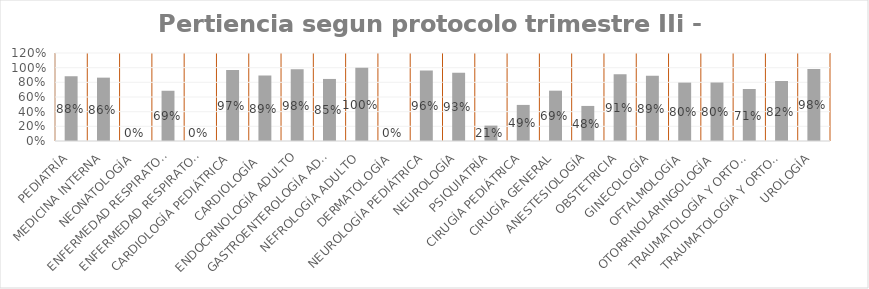
| Category | Series 0 |
|---|---|
| PEDIATRÍA | 0.884 |
| MEDICINA INTERNA | 0.864 |
| NEONATOLOGÍA | 0 |
| ENFERMEDAD RESPIRATORIA PEDIÁTRICA (BRONCOPULMONAR INFANTIL) | 0.685 |
| ENFERMEDAD RESPIRATORIA DE ADULTO (BRONCOPULMONAR) | 0 |
| CARDIOLOGÍA PEDIÁTRICA | 0.969 |
| CARDIOLOGÍA  | 0.894 |
| ENDOCRINOLOGÍA ADULTO | 0.98 |
| GASTROENTEROLOGÍA ADULTO | 0.846 |
| NEFROLOGÍA ADULTO | 1 |
| DERMATOLOGÍA | 0 |
| NEUROLOGÍA PEDIÁTRICA | 0.963 |
| NEUROLOGÍA | 0.931 |
| PSIQUIATRÍA | 0.21 |
| CIRUGÍA PEDIÁTRICA | 0.492 |
| CIRUGÍA GENERAL | 0.686 |
| ANESTESIOLOGÍA | 0.478 |
| OBSTETRICIA | 0.91 |
| GINECOLOGÍA | 0.891 |
| OFTALMOLOGÍA | 0.796 |
| OTORRINOLARINGOLOGÍA | 0.798 |
| TRAUMATOLOGÍA Y ORTOPEDIA PEDIÁTRICA | 0.709 |
| TRAUMATOLOGÍA Y ORTOPEDIA | 0.818 |
| UROLOGÍA | 0.983 |